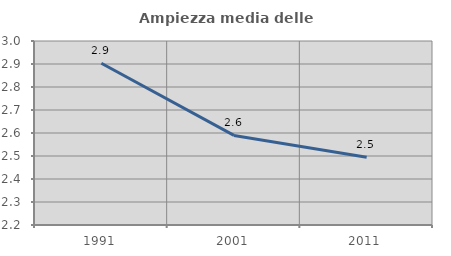
| Category | Ampiezza media delle famiglie |
|---|---|
| 1991.0 | 2.903 |
| 2001.0 | 2.59 |
| 2011.0 | 2.495 |